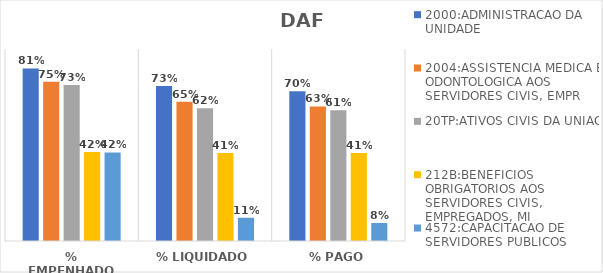
| Category | 2000:ADMINISTRACAO DA UNIDADE | 2004:ASSISTENCIA MEDICA E ODONTOLOGICA AOS SERVIDORES CIVIS, EMPR | 20TP:ATIVOS CIVIS DA UNIAO | 212B:BENEFICIOS OBRIGATORIOS AOS SERVIDORES CIVIS, EMPREGADOS, MI | 4572:CAPACITACAO DE SERVIDORES PUBLICOS FEDERAIS EM PROCESSO DE Q |
|---|---|---|---|---|---|
| % EMPENHADO | 0.809 | 0.746 | 0.731 | 0.417 | 0.415 |
| % LIQUIDADO | 0.727 | 0.653 | 0.622 | 0.413 | 0.109 |
| % PAGO | 0.702 | 0.631 | 0.613 | 0.413 | 0.084 |